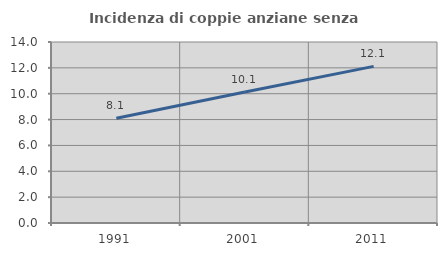
| Category | Incidenza di coppie anziane senza figli  |
|---|---|
| 1991.0 | 8.101 |
| 2001.0 | 10.127 |
| 2011.0 | 12.113 |